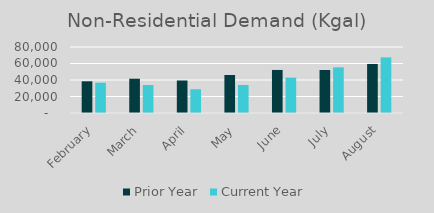
| Category | Prior Year | Current Year |
|---|---|---|
| February | 38439 | 36720 |
| March | 41545 | 33872 |
| April | 39390 | 28794 |
| May | 46068 | 33923 |
| June | 52164 | 42862 |
| July | 52094 | 55350 |
| August | 59449 | 67417 |